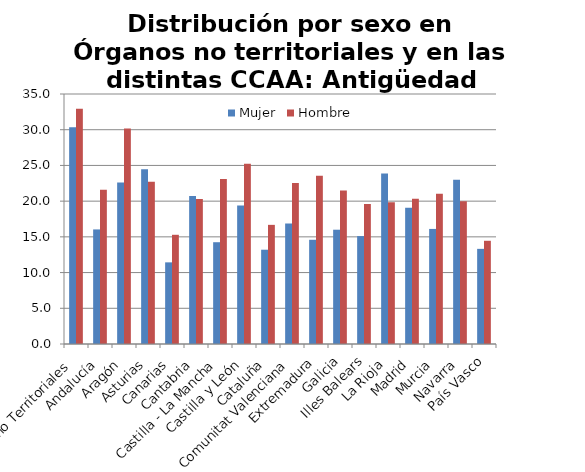
| Category | Mujer | Hombre |
|---|---|---|
| Órganos no Territoriales | 30.36 | 32.93 |
| Andalucía | 16.04 | 21.6 |
| Aragón | 22.6 | 30.17 |
| Asturias | 24.48 | 22.7 |
| Canarias | 11.43 | 15.29 |
| Cantabria | 20.71 | 20.3 |
| Castilla - La Mancha | 14.25 | 23.1 |
| Castilla y León | 19.4 | 25.25 |
| Cataluña | 13.2 | 16.68 |
| Comunitat Valenciana | 16.87 | 22.54 |
| Extremadura | 14.59 | 23.57 |
| Galicia | 16 | 21.49 |
| Illes Balears | 15.11 | 19.59 |
| La Rioja | 23.86 | 19.83 |
| Madrid | 19.08 | 20.33 |
| Murcia | 16.11 | 21.04 |
| Navarra | 23 | 20 |
| País Vasco | 13.32 | 14.45 |